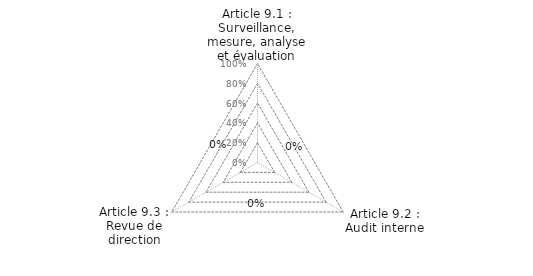
| Category | Article 9.1 : Surveillance, mesure, analyse et évaluation Article 9.2 : Audit interne Article 9.3 : Revue de direction |
|---|---|
| Article 9.1 : Surveillance, mesure, analyse et évaluation | 0 |
| Article 9.2 : Audit interne | 0 |
| Article 9.3 : Revue de direction | 0 |